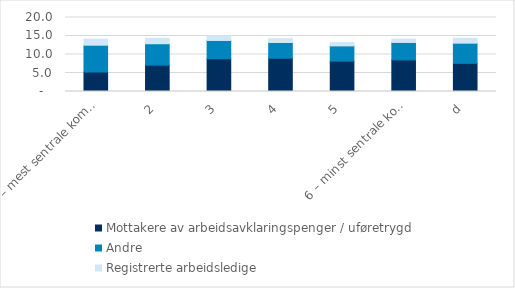
| Category | Mottakere av arbeidsavklaringspenger / uføretrygd | Andre | Registrerte arbeidsledige |
|---|---|---|---|
| 1 – mest sentrale kommuner | 5.261 | 7.253 | 1.625 |
| 2 | 7.134 | 5.774 | 1.463 |
| 3 | 8.844 | 4.949 | 1.242 |
| 4 | 8.98 | 4.255 | 1.032 |
| 5 | 8.22 | 4.109 | 0.935 |
| 6 – minst sentrale kommuner  | 8.541 | 4.714 | 0.901 |
| d | 7.612 | 5.452 | 1.307 |